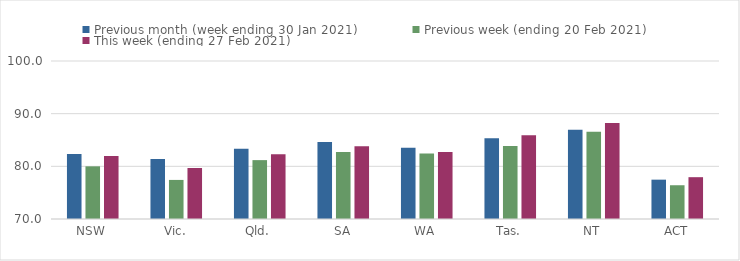
| Category | Previous month (week ending 30 Jan 2021) | Previous week (ending 20 Feb 2021) | This week (ending 27 Feb 2021) |
|---|---|---|---|
| NSW | 82.33 | 80 | 81.96 |
| Vic. | 81.39 | 77.42 | 79.68 |
| Qld. | 83.35 | 81.18 | 82.31 |
| SA | 84.62 | 82.71 | 83.83 |
| WA | 83.53 | 82.44 | 82.73 |
| Tas. | 85.31 | 83.88 | 85.92 |
| NT | 86.93 | 86.55 | 88.25 |
| ACT | 77.47 | 76.41 | 77.94 |